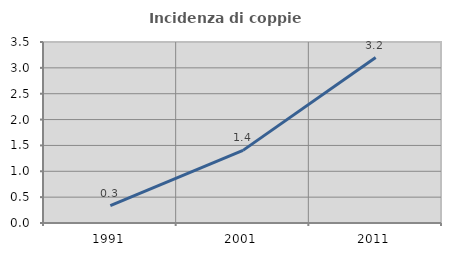
| Category | Incidenza di coppie miste |
|---|---|
| 1991.0 | 0.337 |
| 2001.0 | 1.404 |
| 2011.0 | 3.199 |